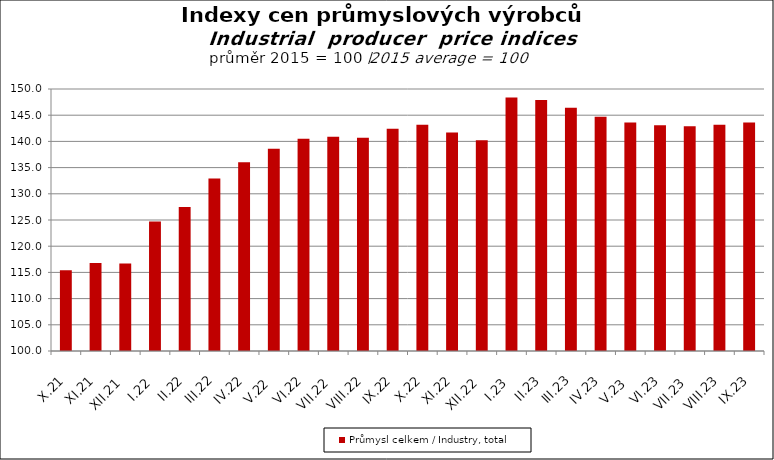
| Category | Průmysl celkem / Industry, total |
|---|---|
| X.21 | 115.4 |
| XI.21 | 116.8 |
| XII.21 | 116.7 |
| I.22 | 124.7 |
| II.22 | 127.5 |
| III.22 | 132.9 |
| IV.22 | 136 |
| V.22 | 138.6 |
| VI.22 | 140.5 |
| VII.22 | 140.9 |
| VIII.22 | 140.7 |
| IX.22 | 142.4 |
| X.22 | 143.2 |
| XI.22 | 141.7 |
| XII.22 | 140.2 |
| I.23 | 148.4 |
| II.23 | 147.9 |
| III.23 | 146.4 |
| IV.23 | 144.7 |
| V.23 | 143.6 |
| VI.23 | 143.1 |
| VII.23 | 142.9 |
| VIII.23 | 143.2 |
| IX.23 | 143.6 |